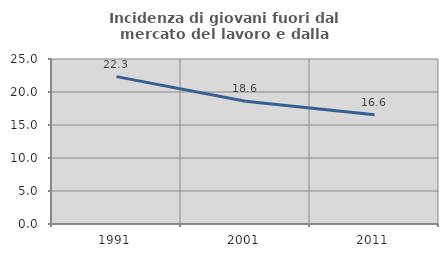
| Category | Incidenza di giovani fuori dal mercato del lavoro e dalla formazione  |
|---|---|
| 1991.0 | 22.328 |
| 2001.0 | 18.605 |
| 2011.0 | 16.563 |